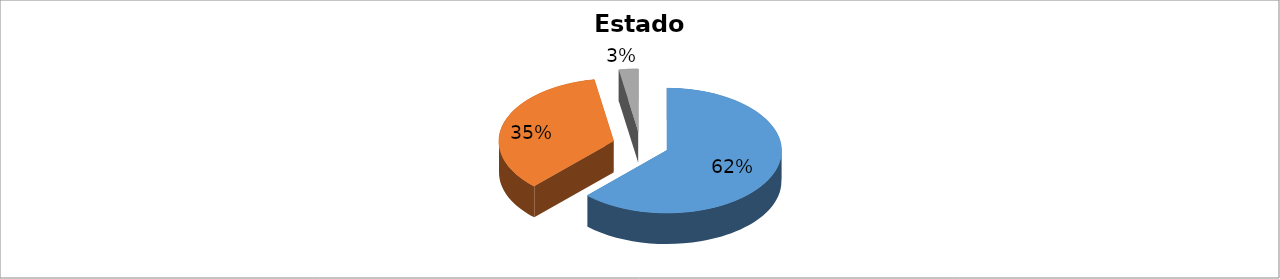
| Category | Series 0 |
|---|---|
| Casado(a)/unión libre | 0.622 |
| Soltero | 0.351 |
| Otro | 0.027 |